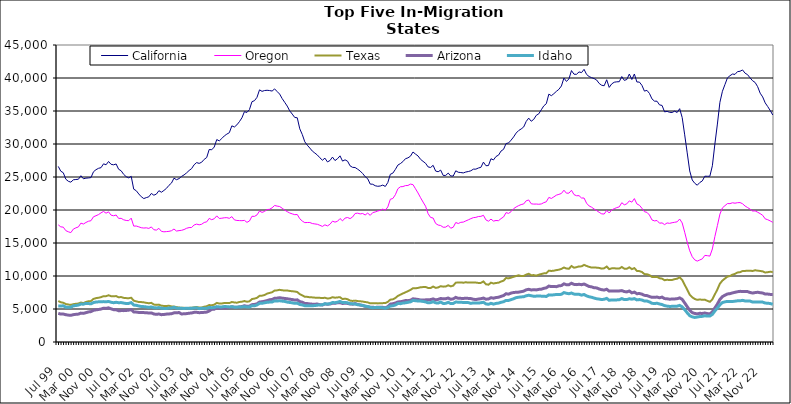
| Category | California | Oregon | Texas | Arizona | Idaho |
|---|---|---|---|---|---|
| Jul 99 | 26605 | 17749 | 6209 | 4339 | 5471 |
| Aug 99 | 25882 | 17447 | 6022 | 4228 | 5444 |
| Sep 99 | 25644 | 17401 | 5941 | 4237 | 5488 |
| Oct 99 | 24669 | 16875 | 5751 | 4134 | 5279 |
| Nov 99 | 24353 | 16701 | 5680 | 4073 | 5260 |
| Dec 99 | 24218 | 16570 | 5619 | 4042 | 5269 |
| Jan 00 | 24574 | 17109 | 5736 | 4142 | 5485 |
| Feb 00 | 24620 | 17295 | 5789 | 4192 | 5530 |
| Mar 00 | 24655 | 17436 | 5826 | 4226 | 5590 |
| Apr 00 | 25195 | 18009 | 5980 | 4375 | 5748 |
| May 00 | 24730 | 17875 | 5897 | 4337 | 5729 |
| Jun 00 | 24825 | 18113 | 6070 | 4444 | 5853 |
| Jul 00 | 24857 | 18294 | 6163 | 4555 | 5824 |
| Aug 00 | 24913 | 18376 | 6199 | 4603 | 5788 |
| Sep 00 | 25792 | 18971 | 6529 | 4804 | 5976 |
| Oct 00 | 26106 | 19135 | 6643 | 4870 | 6058 |
| Nov 00 | 26315 | 19306 | 6705 | 4926 | 6085 |
| Dec 00 | 26415 | 19570 | 6793 | 4991 | 6096 |
| Jan 01 | 26995 | 19781 | 6942 | 5122 | 6119 |
| Feb 01 | 26851 | 19519 | 6948 | 5089 | 6090 |
| Mar 01 | 27352 | 19720 | 7080 | 5180 | 6143 |
| Apr 01 | 26918 | 19221 | 6943 | 5020 | 6020 |
| May 01 | 26848 | 19126 | 6924 | 4899 | 5950 |
| Jun 01 | 26974 | 19241 | 6959 | 4895 | 6019 |
| Jul 01 | 26172 | 18725 | 6778 | 4737 | 5951 |
| Aug 01 | 25943 | 18736 | 6810 | 4757 | 5973 |
| Sep 01 | 25399 | 18514 | 6688 | 4753 | 5895 |
| Oct 01 | 25050 | 18415 | 6650 | 4780 | 5833 |
| Nov 01 | 24873 | 18381 | 6631 | 4826 | 5850 |
| Dec 01 | 25099 | 18765 | 6708 | 4898 | 5969 |
| Jan 02 | 23158 | 17561 | 6261 | 4560 | 5595 |
| Feb 02 | 22926 | 17573 | 6162 | 4531 | 5560 |
| Mar 02 | 22433 | 17452 | 6052 | 4481 | 5458 |
| Apr 02 | 22012 | 17314 | 6046 | 4458 | 5380 |
| May 02 | 21733 | 17267 | 6007 | 4452 | 5358 |
| Jun 02 | 21876 | 17298 | 5933 | 4444 | 5315 |
| Jul 02 | 21997 | 17209 | 5873 | 4383 | 5243 |
| Aug 02 | 22507 | 17436 | 5929 | 4407 | 5315 |
| Sep 02 | 22244 | 17010 | 5672 | 4248 | 5192 |
| Oct 02 | 22406 | 16952 | 5625 | 4191 | 5167 |
| Nov 02 | 22922 | 17223 | 5663 | 4242 | 5221 |
| Dec 02 | 22693 | 16770 | 5499 | 4142 | 5120 |
| Jan 03 | 22964 | 16694 | 5463 | 4166 | 5089 |
| Feb 03 | 23276 | 16727 | 5461 | 4226 | 5077 |
| Mar 03 | 23736 | 16766 | 5486 | 4251 | 5145 |
| Apr 03 | 24079 | 16859 | 5389 | 4289 | 5145 |
| May 03 | 24821 | 17117 | 5378 | 4415 | 5254 |
| Jun 03 | 24592 | 16812 | 5273 | 4426 | 5135 |
| Jul 03 | 24754 | 16875 | 5226 | 4466 | 5124 |
| Aug 03 | 25092 | 16922 | 5181 | 4244 | 5100 |
| Sep 03 | 25316 | 17036 | 5181 | 4279 | 5086 |
| Oct 03 | 25622 | 17228 | 5139 | 4301 | 5110 |
| Nov 03 | 25984 | 17335 | 5175 | 4362 | 5091 |
| Dec 03 | 26269 | 17350 | 5189 | 4396 | 5113 |
| Jan 04 | 26852 | 17734 | 5255 | 4492 | 5152 |
| Feb 04 | 27184 | 17860 | 5301 | 4502 | 5183 |
| Mar 04 | 27062 | 17757 | 5227 | 4443 | 5056 |
| Apr 04 | 27238 | 17840 | 5227 | 4461 | 5104 |
| May 04 | 27671 | 18113 | 5345 | 4493 | 5095 |
| Jun 04 | 27949 | 18201 | 5416 | 4532 | 5103 |
| Jul 04 | 29172 | 18727 | 5597 | 4697 | 5231 |
| Aug 04 | 29122 | 18529 | 5561 | 4945 | 5197 |
| Sep 04 | 29542 | 18678 | 5656 | 4976 | 5237 |
| Oct 04 | 30674 | 19108 | 5922 | 5188 | 5363 |
| Nov 04 | 30472 | 18716 | 5823 | 5106 | 5321 |
| Dec 04 | 30831 | 18755 | 5838 | 5135 | 5312 |
| Jan 05 | 31224 | 18823 | 5906 | 5155 | 5374 |
| Feb 05 | 31495 | 18842 | 5898 | 5168 | 5357 |
| Mar 05 | 31714 | 18738 | 5894 | 5212 | 5313 |
| Apr 05 | 32750 | 18998 | 6060 | 5340 | 5350 |
| May 05 | 32575 | 18504 | 5989 | 5269 | 5276 |
| Jun 05 | 32898 | 18414 | 5954 | 5252 | 5271 |
| Jul 05 | 33384 | 18395 | 6062 | 5322 | 5322 |
| Aug 05 | 33964 | 18381 | 6113 | 5375 | 5316 |
| Sep 05 | 34897 | 18426 | 6206 | 5493 | 5362 |
| Oct 05 | 34780 | 18132 | 6100 | 5408 | 5308 |
| Nov 05 | 35223 | 18332 | 6162 | 5434 | 5314 |
| Dec 05 | 36415 | 19047 | 6508 | 5658 | 5487 |
| Jan 06 | 36567 | 19032 | 6576 | 5688 | 5480 |
| Feb 06 | 37074 | 19257 | 6692 | 5792 | 5616 |
| Mar 06 | 38207 | 19845 | 6993 | 6052 | 5850 |
| Apr 06 | 37976 | 19637 | 7024 | 6101 | 5864 |
| May 06 | 38099 | 19781 | 7114 | 6178 | 5943 |
| Jun 06 | 38141 | 20061 | 7331 | 6276 | 6018 |
| Jul 06 | 38097 | 20111 | 7431 | 6399 | 6046 |
| Aug 06 | 38021 | 20333 | 7542 | 6450 | 6064 |
| Sep 06 | 38349 | 20686 | 7798 | 6627 | 6232 |
| Oct 06 | 37947 | 20591 | 7825 | 6647 | 6216 |
| Nov 06 | 37565 | 20526 | 7907 | 6707 | 6244 |
| Dec 06 | 36884 | 20272 | 7840 | 6648 | 6192 |
| Jan 07 | 36321 | 19984 | 7789 | 6597 | 6151 |
| Feb 07 | 35752 | 19752 | 7799 | 6554 | 6048 |
| Mar 07 | 35025 | 19547 | 7737 | 6487 | 5989 |
| Apr 07 | 34534 | 19412 | 7685 | 6430 | 5937 |
| May 07 | 34022 | 19296 | 7654 | 6353 | 5858 |
| Jun 07 | 33974 | 19318 | 7577 | 6390 | 5886 |
| Jul 07 | 32298 | 18677 | 7250 | 6117 | 5682 |
| Aug 07 | 31436 | 18322 | 7070 | 6034 | 5617 |
| Sep 07 | 30331 | 18087 | 6853 | 5847 | 5500 |
| Oct 07 | 29813 | 18108 | 6839 | 5821 | 5489 |
| Nov 07 | 29384 | 18105 | 6777 | 5769 | 5481 |
| Dec 07 | 28923 | 17949 | 6760 | 5733 | 5499 |
| Jan 08 | 28627 | 17890 | 6721 | 5732 | 5521 |
| Feb 08 | 28328 | 17834 | 6719 | 5749 | 5579 |
| Mar 08 | 27911 | 17680 | 6690 | 5650 | 5614 |
| Apr 08 | 27543 | 17512 | 6656 | 5612 | 5635 |
| May 08 | 27856 | 17754 | 6705 | 5774 | 5798 |
| Jun 08 | 27287 | 17589 | 6593 | 5717 | 5745 |
| Jul 08 | 27495 | 17834 | 6623 | 5761 | 5807 |
| Aug 08 | 28018 | 18309 | 6789 | 5867 | 5982 |
| Sep-08 | 27491 | 18164 | 6708 | 5864 | 5954 |
| Oct 08 | 27771 | 18291 | 6755 | 5942 | 6032 |
| Nov 08 | 28206 | 18706 | 6787 | 5970 | 6150 |
| Dec 08 | 27408 | 18353 | 6505 | 5832 | 5975 |
| Jan 09 | 27601 | 18778 | 6569 | 5890 | 5995 |
| Feb 09 | 27394 | 18863 | 6483 | 5845 | 5936 |
| Mar 09 | 26690 | 18694 | 6273 | 5751 | 5806 |
| Apr 09 | 26461 | 18943 | 6222 | 5735 | 5777 |
| May 09 | 26435 | 19470 | 6272 | 5819 | 5767 |
| Jun 09 | 26187 | 19522 | 6199 | 5700 | 5649 |
| Jul 09 | 25906 | 19408 | 6171 | 5603 | 5617 |
| Aug 09 | 25525 | 19469 | 6128 | 5533 | 5540 |
| Sep 09 | 25050 | 19249 | 6059 | 5405 | 5437 |
| Oct 09 | 24741 | 19529 | 6004 | 5349 | 5369 |
| Nov 09 | 23928 | 19187 | 5854 | 5271 | 5248 |
| Dec 09 | 23899 | 19607 | 5886 | 5261 | 5195 |
| Jan 10 | 23676 | 19703 | 5881 | 5232 | 5234 |
| Feb 10 | 23592 | 19845 | 5850 | 5272 | 5236 |
| Mar 10 | 23634 | 19946 | 5864 | 5278 | 5219 |
| Apr 10 | 23774 | 20134 | 5889 | 5257 | 5201 |
| May 10 | 23567 | 19966 | 5897 | 5172 | 5105 |
| Jun 10 | 24166 | 20464 | 6087 | 5356 | 5237 |
| Jul 10 | 25410 | 21627 | 6417 | 5742 | 5452 |
| Aug 10 | 25586 | 21744 | 6465 | 5797 | 5491 |
| Sep 10 | 26150 | 22314 | 6667 | 5907 | 5609 |
| Oct 10 | 26807 | 23219 | 6986 | 6070 | 5831 |
| Nov 10 | 27033 | 23520 | 7179 | 6100 | 5810 |
| Dec 10 | 27332 | 23551 | 7361 | 6182 | 5898 |
| Jan 11 | 27769 | 23697 | 7525 | 6276 | 5938 |
| Feb 11 | 27898 | 23718 | 7708 | 6267 | 6016 |
| Mar 11 | 28155 | 23921 | 7890 | 6330 | 6081 |
| Apr 11 | 28790 | 23847 | 8146 | 6544 | 6305 |
| May 11 | 28471 | 23215 | 8131 | 6502 | 6248 |
| Jun 11 | 28191 | 22580 | 8199 | 6445 | 6217 |
| Jul 11 | 27678 | 21867 | 8291 | 6368 | 6202 |
| Aug 11 | 27372 | 21203 | 8321 | 6356 | 6146 |
| Sep 11 | 27082 | 20570 | 8341 | 6387 | 6075 |
| Oct 11 | 26528 | 19442 | 8191 | 6402 | 5932 |
| Nov 11 | 26440 | 18872 | 8176 | 6426 | 5968 |
| Dec 11 | 26770 | 18784 | 8401 | 6533 | 6106 |
| Jan 12 | 25901 | 17963 | 8202 | 6390 | 5933 |
| Feb 12 | 25796 | 17718 | 8266 | 6456 | 5900 |
| Mar 12 | 26042 | 17647 | 8456 | 6600 | 6054 |
| Apr 12 | 25239 | 17386 | 8388 | 6534 | 5838 |
| May 12 | 25238 | 17407 | 8401 | 6558 | 5854 |
| Jun 12 | 25593 | 17673 | 8594 | 6669 | 6009 |
| Jul 12 | 25155 | 17237 | 8432 | 6474 | 5817 |
| Aug 12 | 25146 | 17391 | 8536 | 6539 | 5842 |
| Sep 12 | 25942 | 18102 | 8989 | 6759 | 6061 |
| Oct 12 | 25718 | 17953 | 9012 | 6618 | 6027 |
| Nov 12 | 25677 | 18134 | 9032 | 6611 | 6009 |
| Dec 12 | 25619 | 18166 | 8981 | 6601 | 5999 |
| Jan 13 | 25757 | 18344 | 9051 | 6627 | 5989 |
| Feb-13 | 25830 | 18512 | 9001 | 6606 | 5968 |
| Mar-13 | 25940 | 18689 | 9021 | 6577 | 5853 |
| Apr 13 | 26187 | 18844 | 9013 | 6478 | 5925 |
| May 13 | 26192 | 18884 | 9003 | 6431 | 5924 |
| Jun-13 | 26362 | 19013 | 8948 | 6508 | 5896 |
| Jul 13 | 26467 | 19037 | 8958 | 6559 | 5948 |
| Aug 13 | 27253 | 19198 | 9174 | 6655 | 6020 |
| Sep 13 | 26711 | 18501 | 8747 | 6489 | 5775 |
| Oct 13 | 26733 | 18301 | 8681 | 6511 | 5711 |
| Nov 13 | 27767 | 18620 | 8989 | 6709 | 5860 |
| Dec 13 | 27583 | 18320 | 8863 | 6637 | 5740 |
| Jan 14 | 28107 | 18409 | 8939 | 6735 | 5843 |
| Feb-14 | 28313 | 18383 | 8989 | 6779 | 5893 |
| Mar 14 | 28934 | 18696 | 9160 | 6918 | 6015 |
| Apr 14 | 29192 | 18946 | 9291 | 7036 | 6099 |
| May 14 | 30069 | 19603 | 9701 | 7314 | 6304 |
| Jun 14 | 30163 | 19487 | 9641 | 7252 | 6293 |
| Jul-14 | 30587 | 19754 | 9752 | 7415 | 6427 |
| Aug-14 | 31074 | 20201 | 9882 | 7499 | 6557 |
| Sep 14 | 31656 | 20459 | 9997 | 7536 | 6719 |
| Oct 14 | 32037 | 20663 | 10109 | 7555 | 6786 |
| Nov 14 | 32278 | 20825 | 9992 | 7628 | 6831 |
| Dec 14 | 32578 | 20918 | 10006 | 7705 | 6860 |
| Jan 15 | 33414 | 21396 | 10213 | 7906 | 7000 |
| Feb 15 | 33922 | 21518 | 10337 | 7982 | 7083 |
| Mar 15 | 33447 | 20942 | 10122 | 7891 | 7006 |
| Apr-15 | 33731 | 20893 | 10138 | 7906 | 6931 |
| May 15 | 34343 | 20902 | 10053 | 7895 | 6952 |
| Jun-15 | 34572 | 20870 | 10192 | 7973 | 6966 |
| Jul 15 | 35185 | 20916 | 10303 | 8000 | 6949 |
| Aug 15 | 35780 | 21115 | 10399 | 8126 | 6938 |
| Sep 15 | 36109 | 21246 | 10428 | 8207 | 6896 |
| Oct 15 | 37555 | 21908 | 10813 | 8477 | 7140 |
| Nov 15 | 37319 | 21750 | 10763 | 8390 | 7112 |
| Dec 15 | 37624 | 21990 | 10807 | 8395 | 7149 |
| Jan 16 | 37978 | 22248 | 10892 | 8388 | 7201 |
| Feb 16 | 38285 | 22369 | 10951 | 8508 | 7192 |
| Mar 16 | 38792 | 22506 | 11075 | 8547 | 7226 |
| Apr 16 | 39994 | 22999 | 11286 | 8815 | 7487 |
| May 16 | 39488 | 22548 | 11132 | 8673 | 7382 |
| Jun 16 | 39864 | 22556 | 11100 | 8682 | 7315 |
| Jul 16 | 41123 | 22989 | 11516 | 8903 | 7420 |
| Aug 16 | 40573 | 22333 | 11251 | 8731 | 7261 |
| Sep 16 | 40560 | 22162 | 11340 | 8692 | 7216 |
| Oct 16 | 40923 | 22172 | 11456 | 8742 | 7233 |
| Nov 16 | 40817 | 21818 | 11459 | 8685 | 7101 |
| Dec 16 | 41311 | 21815 | 11681 | 8783 | 7203 |
| Jan 17 | 40543 | 21029 | 11524 | 8609 | 6982 |
| Feb 17 | 40218 | 20613 | 11385 | 8416 | 6852 |
| Mar 17 | 40052 | 20425 | 11276 | 8354 | 6775 |
| Apr 17 | 39913 | 20147 | 11297 | 8218 | 6653 |
| May 17 | 39695 | 19910 | 11265 | 8196 | 6552 |
| Jun 17 | 39177 | 19650 | 11225 | 8034 | 6500 |
| Jul 17 | 38901 | 19419 | 11115 | 7923 | 6429 |
| Aug 17 | 38827 | 19389 | 11168 | 7867 | 6479 |
| Sep 17 | 39736 | 19936 | 11426 | 7991 | 6609 |
| Oct 17 | 38576 | 19547 | 11041 | 7708 | 6315 |
| Nov 17 | 39108 | 20013 | 11158 | 7746 | 6381 |
| Dec 17 | 39359 | 20202 | 11185 | 7743 | 6366 |
| Jan 18 | 39420 | 20362 | 11118 | 7736 | 6380 |
| Feb 18 | 39440 | 20476 | 11128 | 7741 | 6407 |
| Mar 18 | 40218 | 21106 | 11362 | 7789 | 6578 |
| Apr 18 | 39637 | 20788 | 11111 | 7642 | 6423 |
| May 18 | 39777 | 20933 | 11097 | 7591 | 6430 |
| Jun 18 | 40602 | 21381 | 11317 | 7721 | 6554 |
| Jul 18 | 39767 | 21189 | 11038 | 7445 | 6489 |
| Aug 18 | 40608 | 21729 | 11200 | 7560 | 6569 |
| Sep 18 | 39395 | 20916 | 10772 | 7318 | 6383 |
| Oct 18 | 39383 | 20724 | 10740 | 7344 | 6429 |
| Nov 18 | 38891 | 20265 | 10605 | 7255 | 6365 |
| Dec 18 | 38013 | 19741 | 10292 | 7069 | 6205 |
| Jan 19 | 38130 | 19643 | 10261 | 7032 | 6203 |
| Feb 19 | 37658 | 19237 | 10132 | 6892 | 6073 |
| Mar 19 | 36831 | 18492 | 9848 | 6766 | 5863 |
| Apr 19 | 36492 | 18349 | 9839 | 6763 | 5827 |
| May 19 | 36481 | 18407 | 9867 | 6809 | 5873 |
| Jun 19 | 35925 | 17998 | 9661 | 6698 | 5761 |
| Jul 19 | 35843 | 18049 | 9598 | 6800 | 5673 |
| Aug 19 | 34870 | 17785 | 9361 | 6577 | 5512 |
| Sep 19 | 34945 | 18038 | 9428 | 6547 | 5437 |
| Oct 19 | 34802 | 17977 | 9385 | 6483 | 5390 |
| Nov 19 | 34775 | 18072 | 9403 | 6511 | 5401 |
| Dec 19 | 34976 | 18140 | 9518 | 6521 | 5419 |
| Jan 20 | 34774 | 18209 | 9594 | 6561 | 5434 |
| Feb 20 | 35352 | 18632 | 9804 | 6682 | 5543 |
| Mar 20 | 34013 | 18041 | 9411 | 6464 | 5330 |
| Apr 20 | 31385 | 16629 | 8666 | 5922 | 4906 |
| May 20 | 28657 | 15123 | 7927 | 5355 | 4419 |
| Jun 20 | 25915 | 13817 | 7164 | 4815 | 3992 |
| Jul 20 | 24545 | 12926 | 6776 | 4457 | 3810 |
| Aug 20 | 24048 | 12443 | 6521 | 4326 | 3720 |
| Sep 20 | 23756 | 12258 | 6386 | 4266 | 3784 |
| Oct 20 | 24166 | 12429 | 6452 | 4347 | 3861 |
| Nov 20 | 24404 | 12597 | 6386 | 4324 | 3883 |
| Dec 20 | 25120 | 13122 | 6420 | 4394 | 3974 |
| Jan 21 | 25111 | 13080 | 6236 | 4304 | 3924 |
| Feb 21 | 25114 | 13015 | 6094 | 4260 | 3930 |
| Mar 21 | 26701 | 14096 | 6455 | 4567 | 4185 |
| Apr 21 | 29998 | 15978 | 7222 | 5164 | 4697 |
| May 21 | 33020 | 17641 | 7969 | 5748 | 5148 |
| Jun 21 | 36320 | 19369 | 8840 | 6450 | 5628 |
| Jul 21 | 37989 | 20320 | 9306 | 6877 | 5984 |
| Aug 21 | 39007 | 20657 | 9615 | 7094 | 6084 |
| Sep 21 | 40023 | 20974 | 9914 | 7277 | 6151 |
| Oct 21 | 40348 | 20966 | 10003 | 7327 | 6140 |
| Nov 21 | 40599 | 21096 | 10203 | 7437 | 6136 |
| Dec 21 | 40548 | 21032 | 10328 | 7532 | 6183 |
| Jan 22 | 40967 | 21106 | 10535 | 7618 | 6237 |
| Feb 22 | 41019 | 21125 | 10579 | 7673 | 6236 |
| Mar 22 | 41220 | 20949 | 10751 | 7660 | 6310 |
| Apr 22 | 40730 | 20602 | 10772 | 7661 | 6221 |
| May 22 | 40504 | 20370 | 10792 | 7636 | 6210 |
| Jun 22 | 40013 | 20127 | 10802 | 7504 | 6199 |
| Jul 22 | 39582 | 19846 | 10761 | 7419 | 6050 |
| Aug 22 | 39321 | 19865 | 10868 | 7487 | 6071 |
| Sep 22 | 38685 | 19666 | 10811 | 7536 | 6074 |
| Oct 22 | 37700 | 19450 | 10764 | 7469 | 6042 |
| Nov 22 | 37133 | 19198 | 10701 | 7425 | 6042 |
| Dec 22 | 36232 | 18659 | 10527 | 7261 | 5898 |
| Jan 23 | 35674 | 18528 | 10578 | 7263 | 5879 |
| Feb 23 | 35072 | 18344 | 10642 | 7211 | 5827 |
| Mar 23 | 34396 | 18133 | 10609 | 7183 | 5713 |